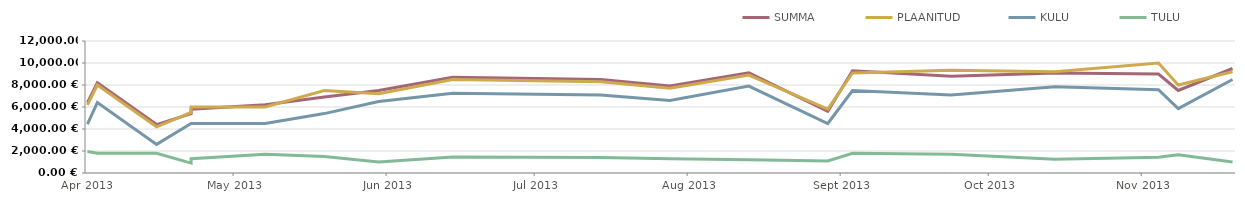
| Category | SUMMA | PLAANITUD | KULU | TULU |
|---|---|---|---|---|
| 2013-04-23 | 6400 | 6200 | 4450 | 1950 |
| 2013-04-25 | 8200 | 8000 | 6400 | 1800 |
| 2013-05-07 | 4400 | 4200 | 2600 | 1800 |
| 2013-05-14 | 5400 | 5500 | 4500 | 900 |
| 2013-05-14 | 5800 | 6000 | 4500 | 1300 |
| 2013-05-29 | 6200 | 6000 | 4500 | 1700 |
| 2013-06-10 | 6900 | 7500 | 5400 | 1500 |
| 2013-06-21 | 7500 | 7200 | 6500 | 1000 |
| 2013-07-06 | 8700 | 8500 | 7250 | 1450 |
| 2013-08-05 | 8500 | 8300 | 7100 | 1400 |
| 2013-08-19 | 7900 | 7700 | 6600 | 1300 |
| 2013-09-04 | 9100 | 8900 | 7900 | 1200 |
| 2013-09-20 | 5600 | 5800 | 4500 | 1100 |
| 2013-09-25 | 9300 | 9100 | 7500 | 1800 |
| 2013-10-15 | 8800 | 9350 | 7100 | 1700 |
| 2013-11-05 | 9100 | 9200 | 7850 | 1250 |
| 2013-11-26 | 9000 | 10000 | 7575 | 1425 |
| 2013-11-30 | 7500 | 8000 | 5850 | 1650 |
| 2013-12-11 | 9500 | 9200 | 8500 | 1000 |